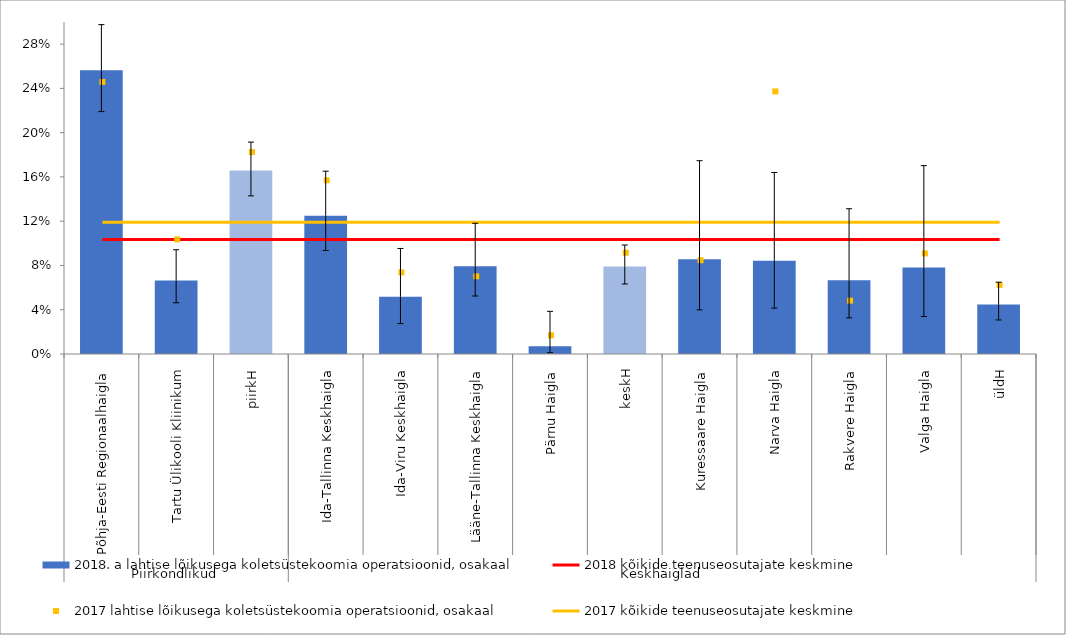
| Category | 2018. a lahtise lõikusega koletsüstekoomia operatsioonid, osakaal |
|---|---|
| 0 | 0.256 |
| 1 | 0.066 |
| 2 | 0.166 |
| 3 | 0.125 |
| 4 | 0.052 |
| 5 | 0.079 |
| 6 | 0.007 |
| 7 | 0.079 |
| 8 | 0.086 |
| 9 | 0.084 |
| 10 | 0.067 |
| 11 | 0.078 |
| 12 | 0.045 |